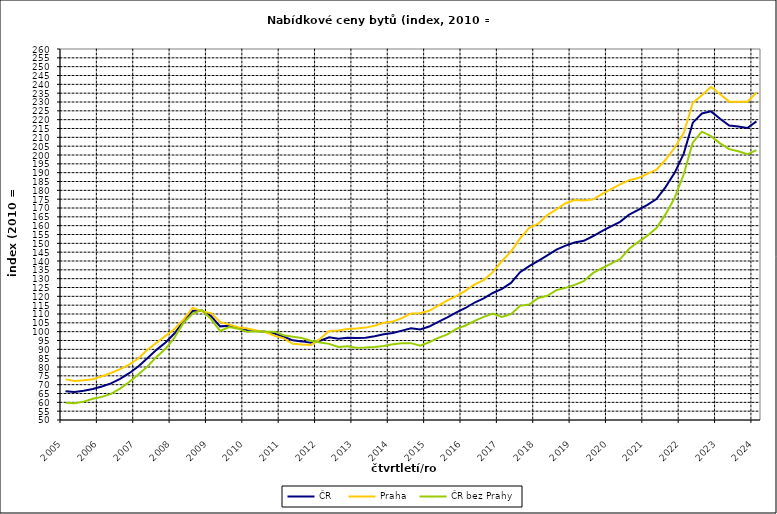
| Category | ČR  | Praha | ČR bez Prahy  |
|---|---|---|---|
| 2005.0 | 66.3 | 73 | 59.7 |
| nan | 65.8 | 72.1 | 59.5 |
| nan | 66.5 | 72.5 | 60.4 |
| nan | 67.5 | 73.1 | 62 |
| 2006.0 | 69 | 74.8 | 63.1 |
| nan | 70.7 | 76.6 | 64.8 |
| nan | 73.3 | 78.8 | 67.8 |
| nan | 76.5 | 81.4 | 71.5 |
| 2007.0 | 80.3 | 84.8 | 75.8 |
| nan | 84.9 | 89.7 | 80.2 |
| nan | 89.7 | 93.7 | 85.7 |
| nan | 93.9 | 97.6 | 90.3 |
| 2008.0 | 99.1 | 101.5 | 96.8 |
| nan | 106.1 | 107 | 105.2 |
| nan | 111.8 | 113.5 | 110.2 |
| nan | 111.9 | 111.5 | 112.3 |
| 2009.0 | 108.8 | 110.5 | 107.2 |
| nan | 103 | 105.5 | 100.4 |
| nan | 103.3 | 104 | 102.6 |
| nan | 102.1 | 102.5 | 101.7 |
| 2010.0 | 100.8 | 101.8 | 99.9 |
| nan | 100.4 | 100.7 | 100.2 |
| nan | 99.9 | 99.8 | 99.9 |
| nan | 98.9 | 97.7 | 100 |
| 2011.0 | 97.1 | 96.2 | 98 |
| nan | 95.1 | 93.1 | 97.1 |
| nan | 94.5 | 92.7 | 96.4 |
| nan | 93.7 | 92.5 | 94.9 |
| 2012.0 | 94.9 | 95.9 | 93.9 |
| nan | 96.8 | 100.4 | 93.1 |
| nan | 96 | 100.7 | 91.3 |
| nan | 96.6 | 101.5 | 91.7 |
| 2013.0 | 96.4 | 101.8 | 90.9 |
| nan | 96.6 | 102.3 | 91 |
| nan | 97.4 | 103.4 | 91.3 |
| nan | 98.5 | 105 | 91.9 |
| 2014.0 | 99.3 | 105.7 | 92.9 |
| nan | 100.6 | 107.7 | 93.4 |
| nan | 101.9 | 110.3 | 93.5 |
| nan | 101.2 | 110.4 | 92.1 |
| 2015.0 | 102.9 | 111.8 | 94 |
| nan | 105.6 | 114.7 | 96.5 |
| nan | 108.1 | 117.7 | 98.5 |
| nan | 110.9 | 120.1 | 101.6 |
| 2016.0 | 113.4 | 123.2 | 103.5 |
| nan | 116.5 | 126.8 | 106.1 |
| nan | 118.8 | 129.2 | 108.4 |
| nan | 121.9 | 133.7 | 110.2 |
| 2017.0 | 124.2 | 140 | 108.3 |
| nan | 127.6 | 145.3 | 109.9 |
| nan | 133.7 | 152.8 | 114.6 |
| nan | 137.1 | 158.8 | 115.4 |
| 2018.0 | 140.1 | 161.1 | 119.1 |
| nan | 143.2 | 166 | 120.3 |
| nan | 146.4 | 169.2 | 123.5 |
| nan | 148.7 | 172.7 | 124.8 |
| 2019.0 | 150.5 | 174.5 | 126.5 |
| nan | 151.4 | 174.2 | 128.6 |
| nan | 154 | 174.8 | 133.1 |
| nan | 156.9 | 177.8 | 135.9 |
| 2020.0 | 159.6 | 180.7 | 138.5 |
| nan | 162.2 | 183.4 | 141.1 |
| nan | 166.3 | 185.7 | 146.9 |
| nan | 168.9 | 187 | 150.8 |
| 2021.0 | 171.8 | 189.3 | 154.3 |
| nan | 175.1 | 191.7 | 158.6 |
| nan | 181.8 | 197.3 | 166.4 |
| nan | 189.9 | 204.1 | 175.7 |
| 2022.0 | 200.8 | 212.5 | 189.1 |
| nan | 218.3 | 229.5 | 207.1 |
| nan | 223.5 | 233.8 | 213.2 |
| nan | 224.7 | 238.6 | 210.7 |
| 2023.0 | 220.5 | 234.4 | 206.6 |
| nan | 216.7 | 230.2 | 203.3 |
| nan | 216.1 | 230.1 | 202.1 |
| nan | 215.3 | 230.1 | 200.4 |
| 2024.0 | 219 | 235.2 | 202.8 |